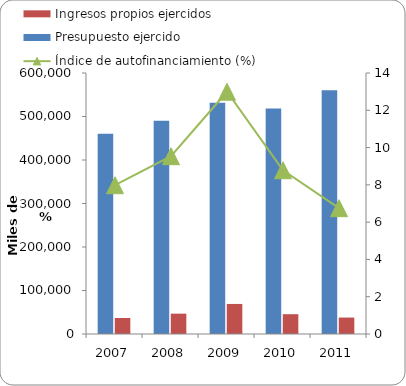
| Category | Presupuesto ejercido | Ingresos propios ejercidos  |
|---|---|---|
| 2007 | 460217 | 36729 |
| 2008 | 490288 | 46755 |
| 2009 | 531486 | 69071 |
| 2010 | 518241 | 45528 |
| 2011 | 560225 | 37815 |